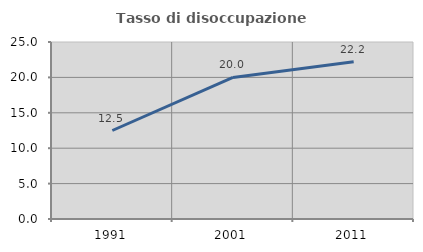
| Category | Tasso di disoccupazione giovanile  |
|---|---|
| 1991.0 | 12.5 |
| 2001.0 | 20 |
| 2011.0 | 22.222 |